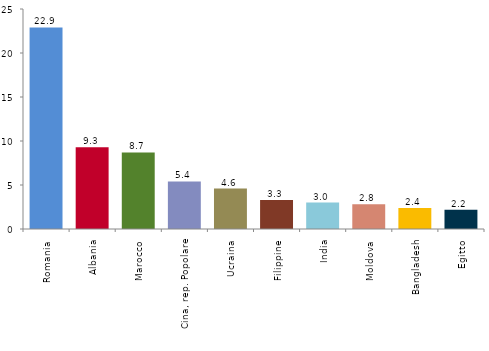
| Category | Series 0 |
|---|---|
| Romania | 22.9 |
| Albania | 9.3 |
| Marocco | 8.7 |
| Cina, rep. Popolare | 5.4 |
| Ucraina | 4.6 |
| Filippine | 3.3 |
| India | 3 |
| Moldova | 2.8 |
| Bangladesh | 2.4 |
| Egitto | 2.2 |